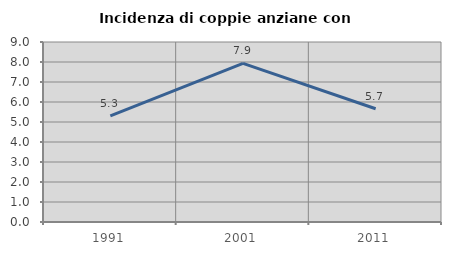
| Category | Incidenza di coppie anziane con figli |
|---|---|
| 1991.0 | 5.302 |
| 2001.0 | 7.93 |
| 2011.0 | 5.66 |